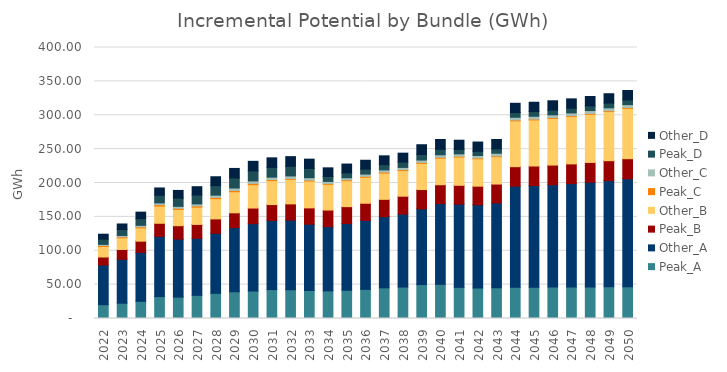
| Category | Peak_A | Other_A | Peak_B | Other_B | Peak_C | Other_C | Peak_D | Other_D |
|---|---|---|---|---|---|---|---|---|
| 2022.0 | 20.392 | 58.496 | 11.876 | 15.571 | 1.374 | 1.708 | 7.651 | 7.35 |
| 2023.0 | 22.606 | 64.889 | 14.385 | 17.217 | 1.463 | 1.991 | 8.811 | 8.159 |
| 2024.0 | 25.395 | 72.18 | 16.554 | 19.583 | 1.546 | 2.259 | 9.928 | 9.545 |
| 2025.0 | 32.352 | 88.841 | 19.335 | 25.431 | 1.927 | 2.777 | 11.244 | 10.771 |
| 2026.0 | 31.528 | 85.653 | 19.795 | 24.031 | 1.729 | 2.788 | 12.087 | 11.408 |
| 2027.0 | 34.205 | 84.142 | 20.529 | 25.409 | 1.799 | 3.111 | 13.061 | 12.296 |
| 2028.0 | 37.123 | 88.632 | 21.245 | 29.846 | 1.86 | 3.361 | 13.976 | 13.189 |
| 2029.0 | 39.472 | 94.632 | 21.894 | 31.088 | 1.919 | 3.61 | 14.834 | 14.041 |
| 2030.0 | 40.55 | 99.395 | 23.099 | 34.465 | 1.943 | 3.635 | 14.727 | 14.166 |
| 2031.0 | 42.668 | 102.102 | 23.411 | 35.322 | 1.474 | 3.676 | 14.377 | 14.098 |
| 2032.0 | 42.47 | 102.837 | 23.867 | 36.26 | 1.252 | 3.775 | 14.231 | 14.219 |
| 2033.0 | 41.289 | 97.903 | 24.087 | 39.611 | 1.256 | 3.735 | 13.49 | 13.823 |
| 2034.0 | 40.758 | 94.763 | 24.526 | 38.054 | 1.235 | 3.011 | 7.314 | 12.718 |
| 2035.0 | 41.705 | 98.403 | 24.995 | 38.216 | 1.255 | 3.204 | 7.229 | 12.966 |
| 2036.0 | 43.025 | 101.76 | 25.319 | 38.477 | 1.304 | 3.274 | 7.419 | 12.991 |
| 2037.0 | 45.259 | 105.065 | 25.564 | 38.737 | 1.359 | 3.362 | 7.615 | 13.148 |
| 2038.0 | 46.386 | 107.675 | 26.431 | 37.817 | 1.376 | 3.331 | 7.891 | 13.13 |
| 2039.0 | 50.059 | 111.829 | 28.436 | 38.63 | 1.413 | 3.505 | 8.146 | 14.463 |
| 2040.0 | 50.42 | 119.136 | 27.858 | 39.161 | 1.396 | 3.68 | 8.095 | 14.464 |
| 2041.0 | 45.978 | 122.905 | 27.728 | 41.696 | 1.168 | 3.568 | 6.473 | 13.622 |
| 2042.0 | 44.986 | 122.862 | 27.44 | 40.432 | 1.16 | 3.708 | 6.242 | 13.644 |
| 2043.0 | 45.277 | 125.261 | 27.889 | 40.445 | 1.181 | 3.879 | 6.374 | 13.883 |
| 2044.0 | 46.208 | 149.047 | 28.832 | 67.571 | 1.245 | 4.117 | 6.919 | 13.74 |
| 2045.0 | 46.277 | 149.888 | 28.901 | 68.066 | 1.246 | 4.138 | 6.921 | 13.76 |
| 2046.0 | 46.373 | 151.073 | 28.993 | 68.808 | 1.246 | 4.165 | 6.921 | 13.785 |
| 2047.0 | 46.496 | 152.602 | 29.108 | 69.796 | 1.247 | 4.198 | 6.92 | 13.815 |
| 2048.0 | 46.646 | 154.475 | 29.246 | 71.032 | 1.248 | 4.236 | 6.918 | 13.849 |
| 2049.0 | 46.823 | 156.693 | 29.407 | 72.515 | 1.249 | 4.281 | 6.915 | 13.887 |
| 2050.0 | 47.027 | 159.255 | 29.59 | 74.244 | 1.25 | 4.332 | 6.911 | 13.931 |